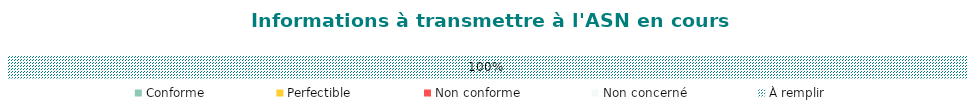
| Category | Conforme | Perfectible | Non conforme | Non concerné | À remplir |
|---|---|---|---|---|---|
| Structure | 0 | 0 | 0 | 0 | 1 |